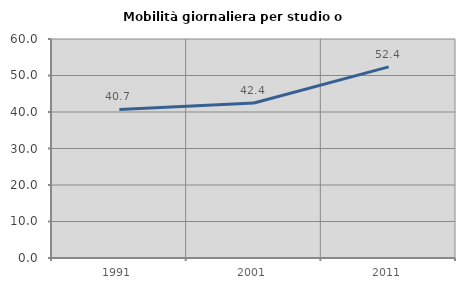
| Category | Mobilità giornaliera per studio o lavoro |
|---|---|
| 1991.0 | 40.694 |
| 2001.0 | 42.447 |
| 2011.0 | 52.362 |